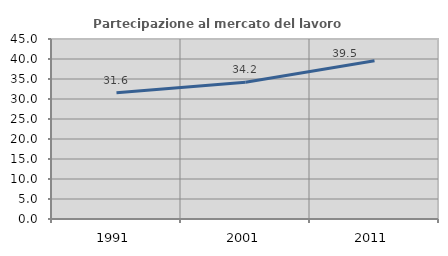
| Category | Partecipazione al mercato del lavoro  femminile |
|---|---|
| 1991.0 | 31.568 |
| 2001.0 | 34.195 |
| 2011.0 | 39.537 |